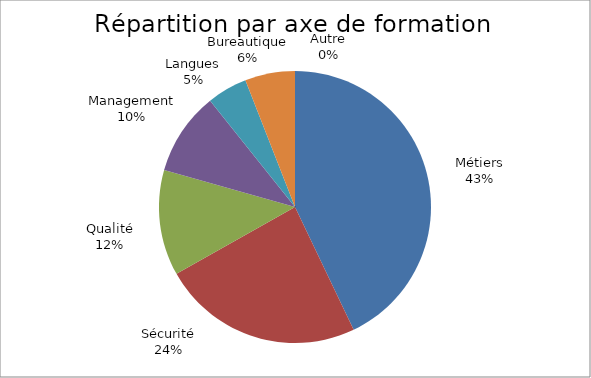
| Category | Series 0 |
|---|---|
| Métiers | 13000 |
| Sécurité | 7250 |
| Qualité | 3800 |
| Management | 3000 |
| Langues | 1450 |
| Bureautique | 1800 |
| Autre | 0 |